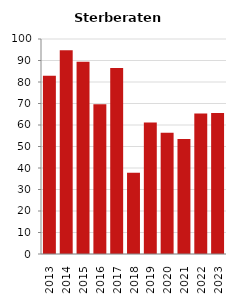
| Category | Sterberate der Bevölkerung ab 80 Jahre (auf Tsd.) |
|---|---|
| 2013.0 | 82.902 |
| 2014.0 | 94.737 |
| 2015.0 | 89.474 |
| 2016.0 | 69.652 |
| 2017.0 | 86.538 |
| 2018.0 | 37.736 |
| 2019.0 | 61.135 |
| 2020.0 | 56.452 |
| 2021.0 | 53.435 |
| 2022.0 | 65.385 |
| 2023.0 | 65.637 |